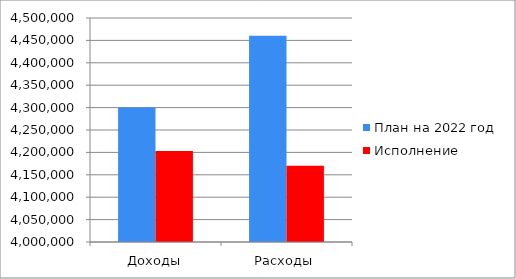
| Category | План на 2022 год | Исполнение |
|---|---|---|
| Доходы | 4300379 | 4203340 |
| Расходы | 4460300 | 4169938 |